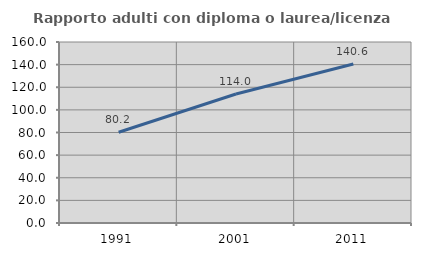
| Category | Rapporto adulti con diploma o laurea/licenza media  |
|---|---|
| 1991.0 | 80.233 |
| 2001.0 | 114 |
| 2011.0 | 140.566 |